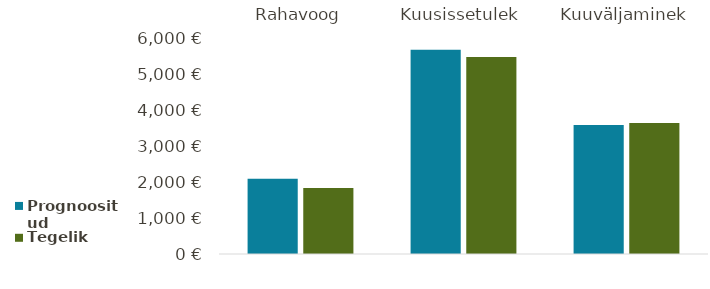
| Category | Prognoositud | Tegelik |
|---|---|---|
| Rahavoog | 2097 | 1845 |
| Kuusissetulek | 5700 | 5500 |
| Kuuväljaminek | 3603 | 3655 |